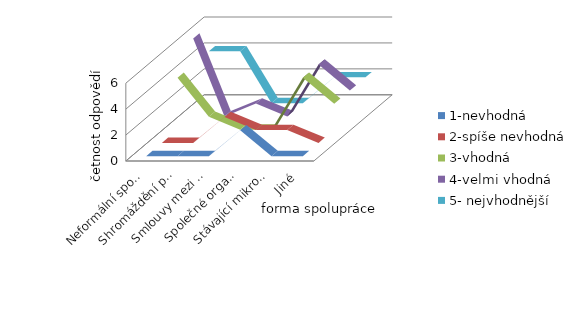
| Category | 1-nevhodná  | 2-spíše nevhodná | 3-vhodná  | 4-velmi vhodná | 5- nejvhodnější |
|---|---|---|---|---|---|
| Neformální spolupráce mezi obcemi | 0 | 0 | 4 | 6 | 4 |
| Shromáždění představitelů obcí v rámci projektu Podpora meziobecní spolupráce | 0 | 0 | 1 | 0 | 4 |
| Smlouvy mezi obcemi | 0 | 2 | 0 | 1 | 0 |
| Společné organizace a firmy	 | 2 | 1 | 0 | 0 | 0 |
| Stávající mikroregion (DSO) | 0 | 1 | 4 | 4 | 2 |
| Jiné | 0 | 0 | 2 | 2 | 2 |